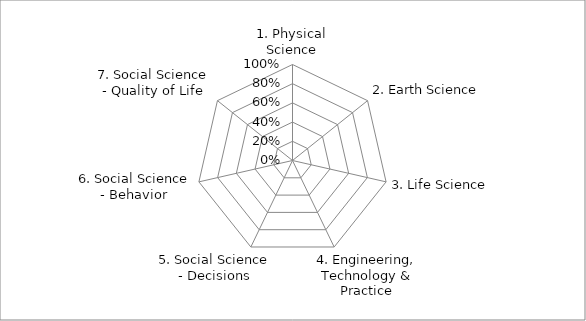
| Category | Series 0 |
|---|---|
| 1. Physical Science | 0 |
| 2. Earth Science | 0 |
| 3. Life Science | 0 |
| 4. Engineering, Technology & Practice | 0 |
| 5. Social Science - Decisions | 0 |
| 6. Social Science - Behavior | 0 |
| 7. Social Science - Quality of Life | 0 |